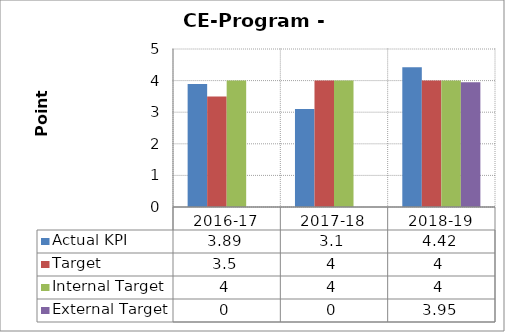
| Category | Actual KPI | Target  | Internal Target | External Target  |
|---|---|---|---|---|
| 2016-17 | 3.89 | 3.5 | 4 | 0 |
| 2017-18 | 3.1 | 4 | 4 | 0 |
| 2018-19 | 4.42 | 4 | 4 | 3.95 |